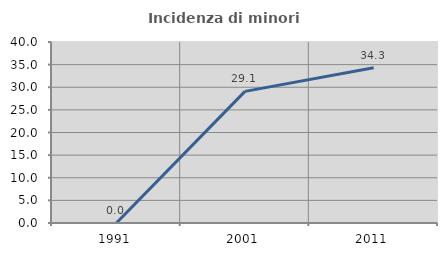
| Category | Incidenza di minori stranieri |
|---|---|
| 1991.0 | 0 |
| 2001.0 | 29.091 |
| 2011.0 | 34.3 |